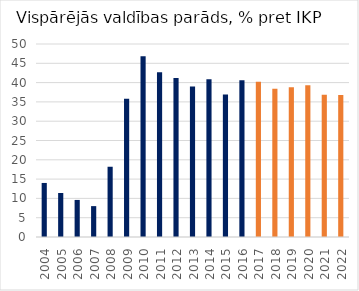
| Category | Latvia |
|---|---|
| 2004 | 14 |
| 2005 | 11.4 |
| 2006 | 9.6 |
| 2007 | 8 |
| 2008 | 18.2 |
| 2009 | 35.8 |
| 2010 | 46.8 |
| 2011 | 42.7 |
| 2012 | 41.2 |
| 2013 | 39 |
| 2014 | 40.9 |
| 2015 | 36.9 |
| 2016 | 40.6 |
| 2017 | 40.2 |
| 2018 | 38.4 |
| 2019 | 38.816 |
| 2020 | 39.339 |
| 2021 | 36.87 |
| 2022 | 36.805 |